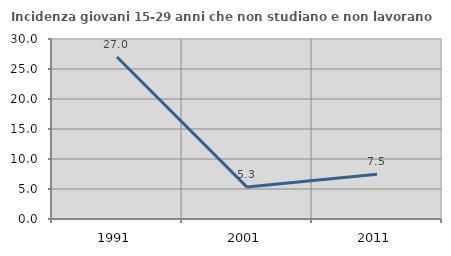
| Category | Incidenza giovani 15-29 anni che non studiano e non lavorano  |
|---|---|
| 1991.0 | 27.007 |
| 2001.0 | 5.319 |
| 2011.0 | 7.477 |